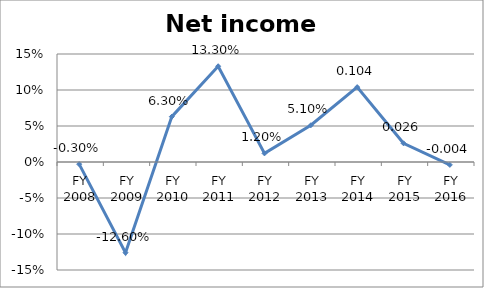
| Category | Net income ratio |
|---|---|
| FY 2016 | -0.004 |
| FY 2015 | 0.026 |
| FY 2014 | 0.104 |
| FY 2013 | 0.051 |
| FY 2012 | 0.012 |
| FY 2011 | 0.133 |
| FY 2010 | 0.063 |
| FY 2009 | -0.126 |
| FY 2008 | -0.003 |